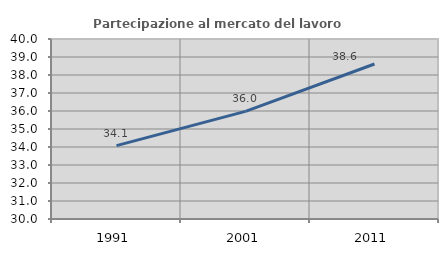
| Category | Partecipazione al mercato del lavoro  femminile |
|---|---|
| 1991.0 | 34.078 |
| 2001.0 | 35.977 |
| 2011.0 | 38.612 |